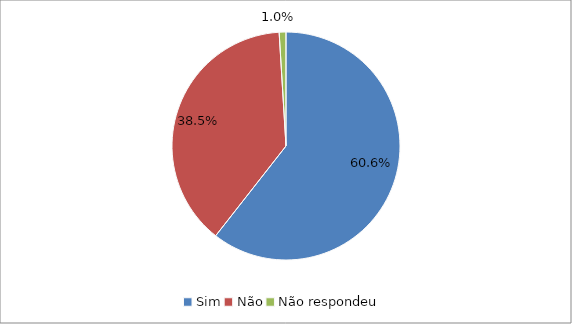
| Category | Series 0 |
|---|---|
| Sim | 0.606 |
| Não | 0.385 |
| Não respondeu | 0.01 |